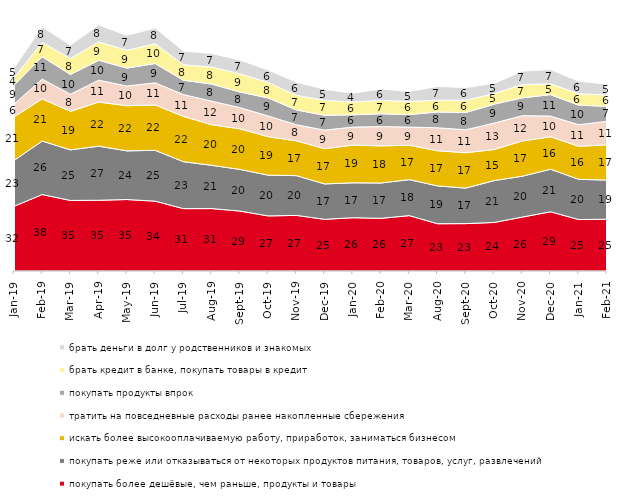
| Category | покупать более дешёвые, чем раньше, продукты и товары | покупать реже или отказываться от некоторых продуктов питания, товаров, услуг, развлечений | искать более высокооплачиваемую работу, приработок, заниматься бизнесом | тратить на повседневные расходы ранее накопленные сбережения | покупать продукты впрок | брать кредит в банке, покупать товары в кредит | брать деньги в долг у родственников и знакомых |
|---|---|---|---|---|---|---|---|
| 2019-01-01 | 31.75 | 22.5 | 21.35 | 6.25 | 9.25 | 3.65 | 4.8 |
| 2019-02-01 | 37.5 | 26.25 | 20.7 | 9.7 | 10.95 | 7.05 | 7.65 |
| 2019-03-01 | 34.61 | 24.814 | 18.896 | 8.404 | 9.697 | 7.857 | 6.564 |
| 2019-04-01 | 34.703 | 26.535 | 21.634 | 10.743 | 9.752 | 9.01 | 8.317 |
| 2019-05-01 | 35.067 | 23.873 | 22.14 | 9.658 | 8.816 | 8.717 | 7.33 |
| 2019-06-01 | 34.264 | 24.938 | 22.244 | 10.873 | 9.476 | 9.676 | 7.781 |
| 2019-07-01 | 30.594 | 23.02 | 22.228 | 10.693 | 7.03 | 7.624 | 6.683 |
| 2019-08-01 | 30.619 | 21.229 | 19.93 | 11.538 | 8.392 | 8.392 | 6.643 |
| 2019-09-01 | 29.406 | 20.446 | 19.901 | 10.396 | 7.673 | 8.911 | 6.733 |
| 2019-10-01 | 27.03 | 20 | 18.861 | 10.149 | 8.861 | 7.624 | 6.089 |
| 2019-11-01 | 27.277 | 19.505 | 17.079 | 7.871 | 7.277 | 7.178 | 6.436 |
| 2019-12-01 | 25.347 | 17.376 | 17.277 | 9.109 | 7.277 | 7.327 | 5.446 |
| 2020-01-01 | 26.139 | 17.129 | 18.515 | 8.812 | 6.04 | 6.287 | 4.257 |
| 2020-02-01 | 25.842 | 17.327 | 18.218 | 9.455 | 6.287 | 6.584 | 5.594 |
| 2020-03-01 | 27.169 | 17.65 | 16.857 | 8.924 | 6.148 | 6.445 | 4.859 |
| 2020-08-01 | 23.188 | 18.57 | 17.229 | 11.271 | 7.746 | 5.809 | 6.753 |
| 2020-09-01 | 23.245 | 17.422 | 17.372 | 11.249 | 8.462 | 6.073 | 6.172 |
| 2020-10-01 | 23.817 | 20.528 | 15.247 | 12.955 | 9.268 | 5.182 | 4.983 |
| 2020-11-01 | 26.45 | 20.05 | 17.3 | 12.4 | 8.75 | 6.55 | 6.55 |
| 2020-12-01 | 29.053 | 20.873 | 15.915 | 10.164 | 10.511 | 5.305 | 6.991 |
| 2021-01-01 | 25.236 | 19.722 | 16.195 | 10.631 | 9.588 | 5.614 | 6.11 |
| 2021-02-01 | 25.409 | 19.206 | 17.32 | 11.464 | 7.345 | 5.558 | 5.36 |